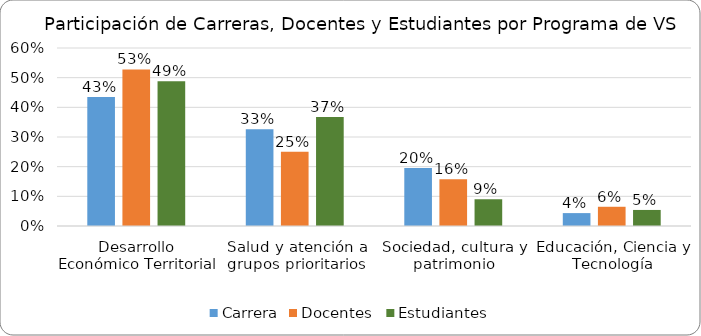
| Category | Carrera | Docentes  | Estudiantes |
|---|---|---|---|
| Desarrollo Económico Territorial | 0.435 | 0.528 | 0.488 |
| Salud y atención a grupos prioritarios | 0.326 | 0.25 | 0.368 |
| Sociedad, cultura y patrimonio | 0.196 | 0.157 | 0.09 |
| Educación, Ciencia y Tecnología | 0.043 | 0.065 | 0.054 |